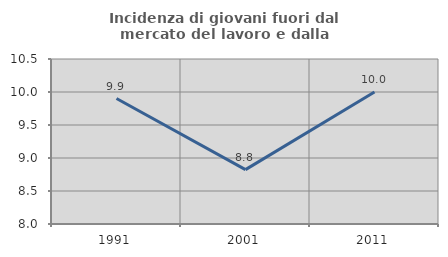
| Category | Incidenza di giovani fuori dal mercato del lavoro e dalla formazione  |
|---|---|
| 1991.0 | 9.901 |
| 2001.0 | 8.824 |
| 2011.0 | 10 |